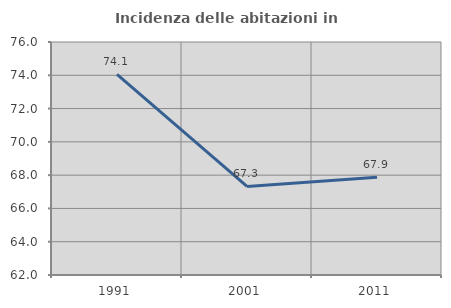
| Category | Incidenza delle abitazioni in proprietà  |
|---|---|
| 1991.0 | 74.055 |
| 2001.0 | 67.324 |
| 2011.0 | 67.874 |